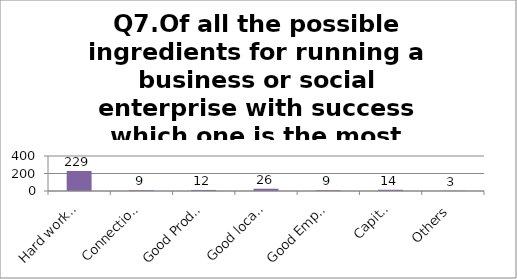
| Category | Q7.Of all the possible ingredients for running a business or social enterprise with success which one is the most important |
|---|---|
| Hard work and determination | 229 |
| Connections | 9 |
| Good Product or Service | 12 |
| Good location for the business | 26 |
| Good Employees | 9 |
| Capital | 14 |
| Others | 3 |